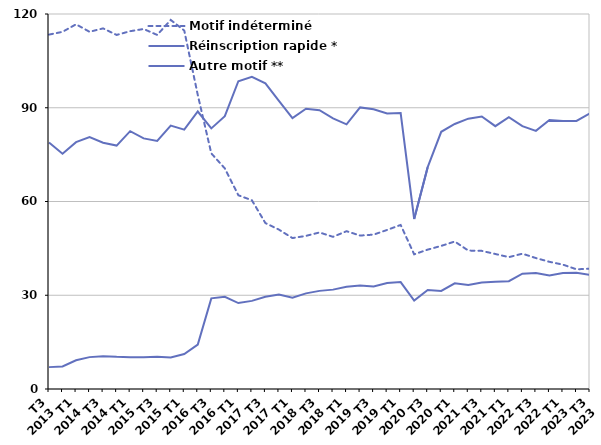
| Category | Motif indéterminé | Réinscription rapide * | Autre motif ** |
|---|---|---|---|
| T3
2013 | 113.4 | 78.9 | 7 |
| T4
2013 | 114.3 | 75.3 | 7.2 |
| T1
2014 | 116.7 | 79 | 9.2 |
| T2
2014 | 114.3 | 80.6 | 10.2 |
| T3
2014 | 115.4 | 78.8 | 10.5 |
| T4
2014 | 113.3 | 77.9 | 10.3 |
| T1
2015 | 114.5 | 82.5 | 10.2 |
| T2
2015 | 115.2 | 80.2 | 10.2 |
| T3
2015 | 113.3 | 79.4 | 10.3 |
| T4
2015 | 118.1 | 84.3 | 10.1 |
| T1
2016 | 114.7 | 83 | 11.2 |
| T2
2016 | 94.1 | 88.8 | 14.2 |
| T3
2016 | 75.4 | 83.4 | 29 |
| T4
2016 | 70.6 | 87.3 | 29.5 |
| T1
2017 | 62 | 98.5 | 27.5 |
| T2
2017 | 60.4 | 99.9 | 28.2 |
| T3
2017 | 53.1 | 97.8 | 29.5 |
| T4
2017 | 51 | 92.2 | 30.2 |
| T1
2018 | 48.3 | 86.7 | 29.2 |
| T2
2018 | 49 | 89.7 | 30.6 |
| T3
2018 | 50.1 | 89.2 | 31.4 |
| T4
2018 | 48.7 | 86.6 | 31.8 |
| T1
2019 | 50.5 | 84.7 | 32.7 |
| T2
2019 | 49.1 | 90.1 | 33.1 |
| T3
2019 | 49.4 | 89.5 | 32.8 |
| T4
2019 | 50.9 | 88.2 | 33.9 |
| T1
2020 | 52.5 | 88.3 | 34.2 |
| T2
2020 | 43.1 | 54.4 | 28.3 |
| T3
2020 | 44.6 | 71 | 31.7 |
| T4
2020 | 45.8 | 82.3 | 31.4 |
| T1
2021 | 47.2 | 84.8 | 33.8 |
| T2
2021 | 44.3 | 86.5 | 33.3 |
| T3
2021 | 44.2 | 87.2 | 34.1 |
| T4
2021 | 43.2 | 84.1 | 34.3 |
| T1
2022 | 42.2 | 87 | 34.5 |
| T2
2022 | 43.3 | 84.1 | 36.9 |
| T3
2022 | 41.9 | 82.6 | 37.1 |
| T4
2022 | 40.7 | 86.1 | 36.3 |
| T1
2023 | 39.8 | 85.8 | 37.1 |
| T2
2023 | 38.3 | 85.8 | 37.2 |
| T3
2023 | 38.5 | 88.2 | 36.5 |